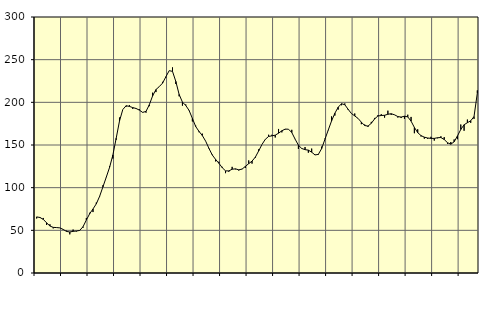
| Category | Piggar | Series 1 |
|---|---|---|
| nan | 63.9 | 65.74 |
| 87.0 | 65.5 | 65.05 |
| 87.0 | 64.5 | 62.82 |
| 87.0 | 56.3 | 58.82 |
| nan | 57.1 | 55.05 |
| 88.0 | 52.3 | 53.47 |
| 88.0 | 53.4 | 53.23 |
| 88.0 | 52.8 | 52.88 |
| nan | 51.4 | 51.08 |
| 89.0 | 49.6 | 48.73 |
| 89.0 | 45.3 | 48.09 |
| 89.0 | 50.9 | 48.81 |
| nan | 48.7 | 49.19 |
| 90.0 | 49.6 | 49.9 |
| 90.0 | 53.1 | 54.28 |
| 90.0 | 64.5 | 62.09 |
| nan | 70.6 | 69.43 |
| 91.0 | 71.4 | 75.02 |
| 91.0 | 82.5 | 81.06 |
| 91.0 | 89.3 | 89.84 |
| nan | 102.8 | 100.93 |
| 92.0 | 112 | 112.19 |
| 92.0 | 125.1 | 123.67 |
| 92.0 | 134.2 | 138.2 |
| nan | 156.2 | 157.85 |
| 93.0 | 182.2 | 178.07 |
| 93.0 | 191.6 | 191.6 |
| 93.0 | 194.9 | 196 |
| nan | 196.7 | 195.24 |
| 94.0 | 192.3 | 193.87 |
| 94.0 | 192.5 | 192.81 |
| 94.0 | 191.9 | 190.87 |
| nan | 188 | 188.2 |
| 95.0 | 187.9 | 189.4 |
| 95.0 | 195.5 | 197.18 |
| 95.0 | 211.3 | 207.61 |
| nan | 212 | 214.95 |
| 96.0 | 218.3 | 218.42 |
| 96.0 | 224 | 222.52 |
| 96.0 | 229 | 229.96 |
| nan | 237.1 | 237.13 |
| 97.0 | 240.9 | 236.27 |
| 97.0 | 221.5 | 224.5 |
| 97.0 | 207.1 | 209.27 |
| nan | 196.1 | 200.23 |
| 98.0 | 197.5 | 196.33 |
| 98.0 | 190.2 | 190.55 |
| 98.0 | 177.6 | 181.19 |
| nan | 172.7 | 171.66 |
| 99.0 | 165 | 165.94 |
| 99.0 | 163.3 | 161.05 |
| 99.0 | 154.5 | 154.5 |
| nan | 145.5 | 145.99 |
| 0.0 | 138.7 | 138.29 |
| 0.0 | 130.8 | 133.11 |
| 0.0 | 130.4 | 128.6 |
| nan | 124.4 | 123.46 |
| 1.0 | 117 | 119.69 |
| 1.0 | 118.7 | 119.64 |
| 1.0 | 124.4 | 121.61 |
| nan | 121.5 | 122.06 |
| 2.0 | 120.1 | 120.9 |
| 2.0 | 122 | 121.75 |
| 2.0 | 123.1 | 124.96 |
| nan | 131.9 | 128.14 |
| 3.0 | 128.2 | 131.12 |
| 3.0 | 135 | 135.76 |
| 3.0 | 144.9 | 143.04 |
| nan | 150.6 | 150.64 |
| 4.0 | 156.4 | 156.62 |
| 4.0 | 162 | 160.02 |
| 4.0 | 162 | 160.73 |
| nan | 158.8 | 161.53 |
| 5.0 | 168.8 | 163.83 |
| 5.0 | 164.8 | 166.68 |
| 5.0 | 168.2 | 168.62 |
| nan | 168.5 | 168.52 |
| 6.0 | 167.8 | 164.63 |
| 6.0 | 157.1 | 156.9 |
| 6.0 | 145.4 | 149.75 |
| nan | 146.2 | 145.93 |
| 7.0 | 147.6 | 144.56 |
| 7.0 | 141 | 143.98 |
| 7.0 | 145.8 | 141.58 |
| nan | 138.2 | 138.4 |
| 8.0 | 138.4 | 138.95 |
| 8.0 | 148.1 | 145.74 |
| 8.0 | 157.5 | 156.68 |
| nan | 167.3 | 167.51 |
| 9.0 | 183.5 | 178.18 |
| 9.0 | 184.5 | 187.23 |
| 9.0 | 191.5 | 194.29 |
| nan | 196.6 | 198.36 |
| 10.0 | 198.7 | 197.21 |
| 10.0 | 191.1 | 191.87 |
| 10.0 | 186.8 | 186.89 |
| nan | 186.9 | 184.09 |
| 11.0 | 181.3 | 181.13 |
| 11.0 | 174.4 | 176.72 |
| 11.0 | 174 | 172.82 |
| nan | 171.2 | 172.14 |
| 12.0 | 177.1 | 175.45 |
| 12.0 | 181.7 | 180.63 |
| 12.0 | 185 | 184.01 |
| nan | 186.1 | 184.57 |
| 13.0 | 182.1 | 184.83 |
| 13.0 | 190.2 | 186.01 |
| 13.0 | 185.3 | 186.65 |
| nan | 185.3 | 185.39 |
| 14.0 | 182.2 | 183.34 |
| 14.0 | 181.6 | 182.71 |
| 14.0 | 180.7 | 183.76 |
| nan | 185.5 | 182.97 |
| 15.0 | 182.9 | 177.96 |
| 15.0 | 163.8 | 170.59 |
| 15.0 | 168.4 | 164.51 |
| nan | 160 | 161.01 |
| 16.0 | 157.4 | 159.19 |
| 16.0 | 157.3 | 158.21 |
| 16.0 | 159.6 | 157.76 |
| nan | 155.2 | 157.76 |
| 17.0 | 157.9 | 158.5 |
| 17.0 | 160.2 | 158.78 |
| 17.0 | 159.2 | 156.43 |
| nan | 151.4 | 152.67 |
| 18.0 | 153.5 | 150.94 |
| 18.0 | 156.5 | 153.77 |
| 18.0 | 156.8 | 160.65 |
| nan | 174 | 168.15 |
| 19.0 | 166.7 | 173.74 |
| 19.0 | 179.8 | 176.14 |
| 19.0 | 176 | 178.37 |
| nan | 180.6 | 183.31 |
| 20.0 | 214 | 210.89 |